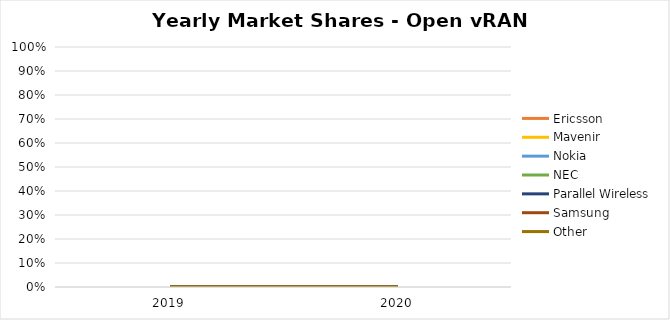
| Category | Altiostar | Ericsson | Fujitsu | Mavenir | Nokia | NEC | Parallel Wireless | Samsung | Other |
|---|---|---|---|---|---|---|---|---|---|
| 2019.0 | 0 | 0 | 0 | 0 | 0 | 0 | 0 | 0 | 0 |
| 2020.0 | 0 | 0 | 0 | 0 | 0 | 0 | 0 | 0 | 0 |